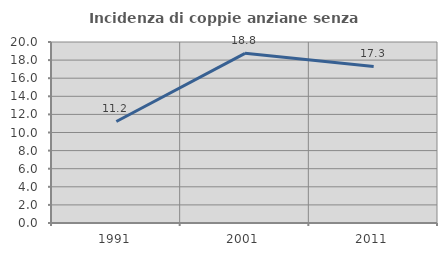
| Category | Incidenza di coppie anziane senza figli  |
|---|---|
| 1991.0 | 11.217 |
| 2001.0 | 18.75 |
| 2011.0 | 17.295 |